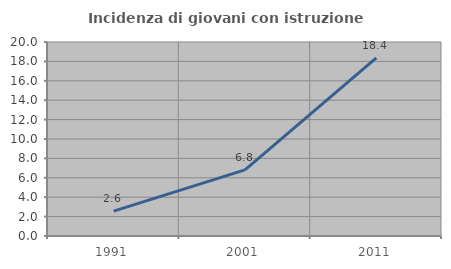
| Category | Incidenza di giovani con istruzione universitaria |
|---|---|
| 1991.0 | 2.564 |
| 2001.0 | 6.818 |
| 2011.0 | 18.367 |